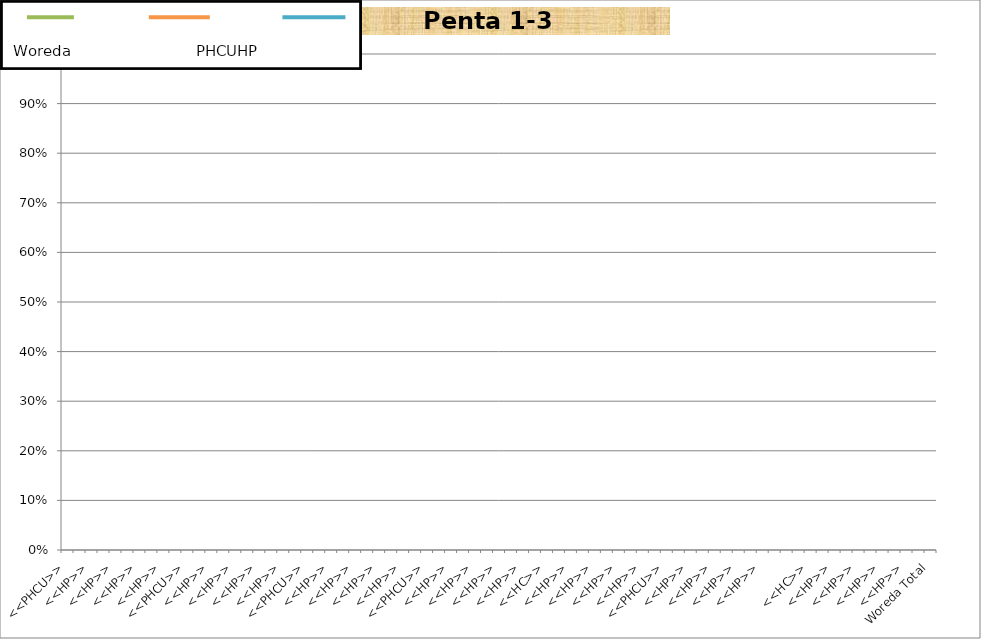
| Category | Penta1-3 |
|---|---|
| <<PHCU>> | 0 |
| <<HC>> | 0 |
| <<HP>> | 0 |
| <<HP>> | 0 |
| <<HP>> | 0 |
| <<HP>> | 0 |
| <<HP>> | 0 |
| <<HP>> | 0 |
| <<HP>> | 0 |
|  | 0 |
| <<PHCU>> | 0 |
| <<HC>> | 0 |
| <<HP>> | 0 |
| <<HP>> | 0 |
| <<HP>> | 0 |
| <<HP>> | 0 |
| <<HP>> | 0 |
| <<HP>> | 0 |
| <<HP>> | 0 |
|  | 0 |
| <<PHCU>> | 0 |
| <<HC>> | 0 |
| <<HP>> | 0 |
| <<HP>> | 0 |
| <<HP>> | 0 |
| <<HP>> | 0 |
| <<HP>> | 0 |
| <<HP>> | 0 |
| <<HP>> | 0 |
|  | 0 |
| <<PHCU>> | 0 |
| <<HC>> | 0 |
| <<HP>> | 0 |
| <<HP>> | 0 |
| <<HP>> | 0 |
| <<HP>> | 0 |
| <<HP>> | 0 |
| <<HP>> | 0 |
| <<HP>> | 0 |
|  | 0 |
| <<HC>> | 0 |
| <<HP>> | 0 |
| <<HP>> | 0 |
| <<HP>> | 0 |
| <<HP>> | 0 |
| <<HP>> | 0 |
| <<HP>> | 0 |
| <<HP>> | 0 |
| <<HP>> | 0 |
|  | 0 |
| <<PHCU>> | 0 |
| <<HC>> | 0 |
| <<HP>> | 0 |
| <<HP>> | 0 |
| <<HP>> | 0 |
| <<HP>> | 0 |
| <<HP>> | 0 |
| <<HP>> | 0 |
| <<HP>> | 0 |
| <<HP>> | 0 |
|  | 0 |
| <<PHCU>> | 0 |
| <<HC>> | 0 |
| <<HP>> | 0 |
| <<HP>> | 0 |
| <<HP>> | 0 |
| <<HP>> | 0 |
| <<HP>> | 0 |
| <<HP>> | 0 |
| <<HP>> | 0 |
| <<HP>> | 0 |
|  | 0 |
| Woreda Total | 0 |